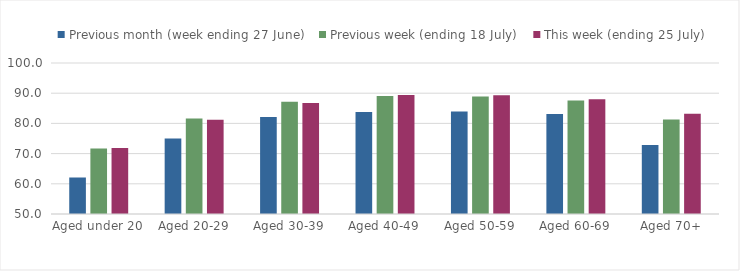
| Category | Previous month (week ending 27 June) | Previous week (ending 18 July) | This week (ending 25 July) |
|---|---|---|---|
| Aged under 20 | 62.087 | 71.684 | 71.874 |
| Aged 20-29 | 74.984 | 81.657 | 81.178 |
| Aged 30-39 | 82.16 | 87.129 | 86.788 |
| Aged 40-49 | 83.792 | 89.07 | 89.422 |
| Aged 50-59 | 83.932 | 88.93 | 89.318 |
| Aged 60-69 | 83.074 | 87.583 | 88.03 |
| Aged 70+ | 72.822 | 81.274 | 83.165 |